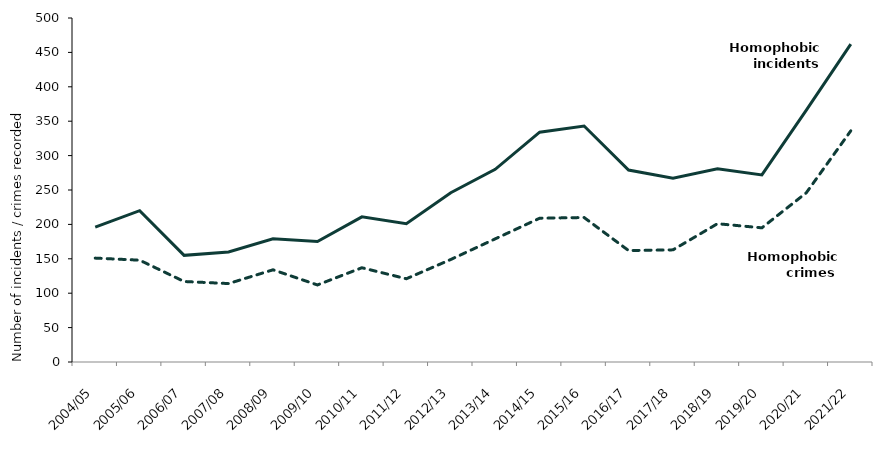
| Category | Homophobic incidents | Homophobic crimes |
|---|---|---|
| 2004/05 | 196 | 151 |
| 2005/06 | 220 | 148 |
| 2006/07 | 155 | 117 |
| 2007/08 | 160 | 114 |
| 2008/09 | 179 | 134 |
| 2009/10 | 175 | 112 |
| 2010/11 | 211 | 137 |
| 2011/12 | 201 | 121 |
| 2012/13 | 246 | 149 |
| 2013/14 | 280 | 179 |
| 2014/15 | 334 | 209 |
| 2015/16 | 343 | 210 |
| 2016/17 | 279 | 162 |
| 2017/18 | 267 | 163 |
| 2018/19 | 281 | 201 |
| 2019/20 | 272 | 195 |
| 2020/21 | 366 | 246 |
| 2021/22 | 462 | 336 |